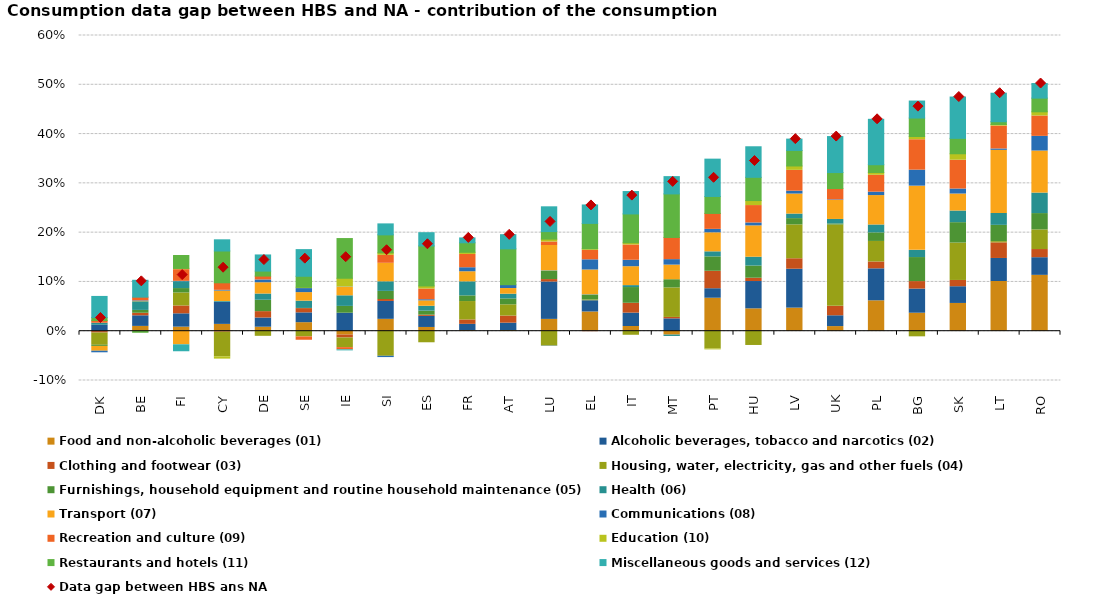
| Category | Food and non-alcoholic beverages (01) | Alcoholic beverages, tobacco and narcotics (02) | Clothing and footwear (03) | Housing, water, electricity, gas and other fuels (04) | Furnishings, household equipment and routine household maintenance (05) | Health (06) | Transport (07) | Communications (08) | Recreation and culture (09) | Education (10) | Restaurants and hotels (11) | Miscellaneous goods and services (12) |
|---|---|---|---|---|---|---|---|---|---|---|---|---|
| DK | -0.001 | 0.012 | -0.003 | -0.025 | -0.002 | 0.004 | -0.01 | -0.003 | 0.004 | 0.002 | 0.006 | 0.043 |
| BE | 0.01 | 0.021 | 0.005 | 0 | 0.006 | 0.018 | 0.001 | 0.001 | 0.008 | 0 | -0.002 | 0.034 |
| FI | 0.008 | 0.027 | 0.016 | 0.026 | 0.009 | 0.014 | -0.028 | 0.001 | 0.024 | 0.003 | 0.026 | -0.012 |
| CY | 0.014 | 0.045 | -0.002 | -0.05 | 0 | 0.001 | 0.021 | 0.002 | 0.015 | -0.005 | 0.065 | 0.023 |
| DE | 0.008 | 0.019 | 0.013 | -0.01 | 0.023 | 0.013 | 0.023 | 0.006 | 0.007 | 0.001 | 0.01 | 0.033 |
| SE | 0.017 | 0.02 | 0.009 | -0.012 | 0 | 0.015 | 0.017 | 0.008 | -0.007 | 0.003 | 0.022 | 0.054 |
| IE | -0.008 | 0.037 | -0.006 | -0.02 | 0.014 | 0.021 | 0.017 | 0.001 | -0.004 | 0.018 | 0.081 | 0 |
| SI | 0.024 | 0.036 | 0.004 | -0.051 | 0.016 | 0.019 | 0.038 | -0.003 | 0.016 | 0.005 | 0.037 | 0.022 |
| ES | 0.008 | 0.022 | 0.003 | -0.023 | 0.008 | 0.01 | 0.011 | 0.002 | 0.022 | 0.006 | 0.081 | 0.027 |
| FR | 0.001 | 0.013 | 0.009 | 0.037 | 0.012 | 0.028 | 0.02 | 0.008 | 0.027 | 0.004 | 0.019 | 0.01 |
| AT | 0.001 | 0.015 | 0.014 | 0.023 | 0.012 | 0.01 | 0.011 | 0.007 | 0 | 0 | 0.073 | 0.029 |
| LU | 0.024 | 0.076 | 0.005 | -0.03 | 0.017 | 0.001 | 0.051 | 0 | 0.007 | 0.006 | 0.015 | 0.05 |
| EL | 0.039 | 0.023 | -0.001 | 0.002 | 0.009 | 0.001 | 0.05 | 0.021 | 0.019 | 0.003 | 0.051 | 0.037 |
| IT | 0.01 | 0.027 | 0.02 | -0.008 | 0.032 | 0.004 | 0.038 | 0.013 | 0.031 | 0.004 | 0.059 | 0.045 |
| MT | -0.008 | 0.025 | 0.003 | 0.06 | 0.017 | -0.003 | 0.03 | 0.011 | 0.045 | 0 | 0.088 | 0.035 |
| PT | 0.067 | 0.019 | 0.035 | -0.036 | 0.029 | 0.01 | 0.039 | 0.007 | 0.032 | -0.002 | 0.034 | 0.076 |
| HU | 0.045 | 0.055 | 0.007 | -0.029 | 0.025 | 0.018 | 0.064 | 0.006 | 0.035 | 0.01 | 0.047 | 0.062 |
| LV | 0.047 | 0.079 | 0.021 | 0.069 | 0.013 | 0.009 | 0.041 | 0.006 | 0.042 | 0.009 | 0.032 | 0.023 |
| UK | 0.009 | 0.022 | 0.019 | 0.165 | 0.002 | 0.009 | 0.038 | 0.001 | 0.022 | 0.001 | 0.032 | 0.073 |
| PL | 0.062 | 0.065 | 0.014 | 0.042 | 0.017 | 0.016 | 0.06 | 0.007 | 0.034 | 0.006 | 0.016 | 0.092 |
| BG | 0.037 | 0.049 | 0.015 | -0.011 | 0.049 | 0.015 | 0.13 | 0.032 | 0.062 | 0.007 | 0.037 | 0.034 |
| SK | 0.056 | 0.034 | 0.013 | 0.076 | 0.041 | 0.024 | 0.034 | 0.01 | 0.058 | 0.013 | 0.031 | 0.084 |
| LT | 0.101 | 0.047 | 0.032 | 0.002 | 0.033 | 0.024 | 0.128 | 0.003 | 0.046 | 0.003 | 0.006 | 0.058 |
| RO | 0.113 | 0.036 | 0.017 | 0.04 | 0.033 | 0.042 | 0.085 | 0.03 | 0.041 | 0.009 | 0.028 | 0.03 |